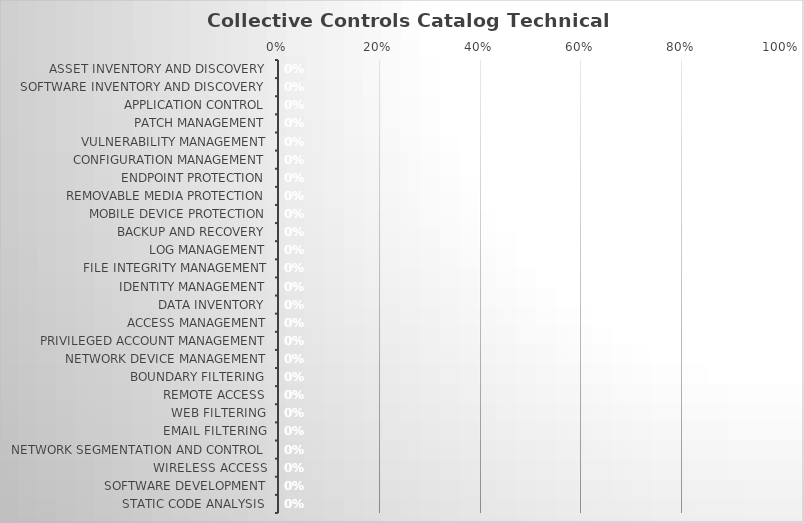
| Category | Implementation Score: |
|---|---|
| Asset Inventory and Discovery | 0 |
| Software Inventory and Discovery | 0 |
| Application Control | 0 |
| Patch Management | 0 |
| Vulnerability Management | 0 |
| Configuration Management | 0 |
| Endpoint Protection | 0 |
| Removable Media Protection | 0 |
| Mobile Device Protection | 0 |
| Backup and Recovery | 0 |
| Log Management | 0 |
| File Integrity Management | 0 |
| Identity Management | 0 |
| Data Inventory | 0 |
| Access Management | 0 |
| Privileged Account Management | 0 |
| Network Device Management | 0 |
| Boundary Filtering | 0 |
| Remote Access | 0 |
| Web Filtering | 0 |
| Email Filtering | 0 |
| Network Segmentation and Control | 0 |
| Wireless Access | 0 |
| Software Development | 0 |
| Static Code Analysis | 0 |